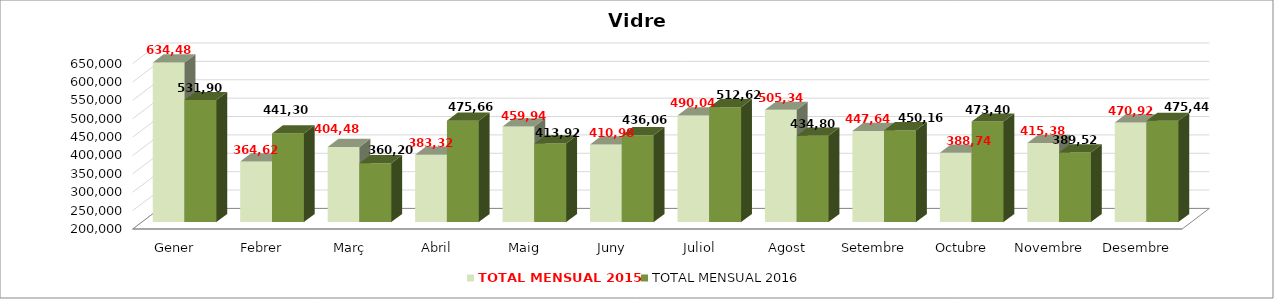
| Category | TOTAL MENSUAL 2015 | TOTAL MENSUAL 2016 |
|---|---|---|
| Gener | 634479.98 | 531900.01 |
| Febrer | 364620.04 | 441300.01 |
| Març | 404480.01 | 360200 |
| Abril | 383320.02 | 475660.04 |
| Maig | 459940 | 413920.01 |
| Juny | 410980 | 436060.01 |
| Juliol | 490040.03 | 512620.03 |
| Agost | 505339.87 | 434801.17 |
| Setembre | 447640.03 | 450160 |
| Octubre | 388740.07 | 473400.01 |
| Novembre | 415380.01 | 389521.37 |
| Desembre | 470920.03 | 475440.01 |